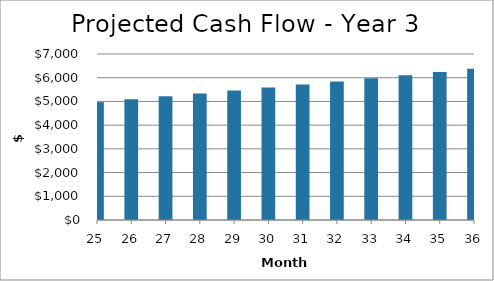
| Category | Year 3 |
|---|---|
| 25.0 | 4971.253 |
| 26.0 | 5091.793 |
| 27.0 | 5213.815 |
| 28.0 | 5337.301 |
| 29.0 | 5462.231 |
| 30.0 | 5588.583 |
| 31.0 | 5716.33 |
| 32.0 | 5845.443 |
| 33.0 | 5975.89 |
| 34.0 | 6107.635 |
| 35.0 | 6240.637 |
| 36.0 | 6374.851 |